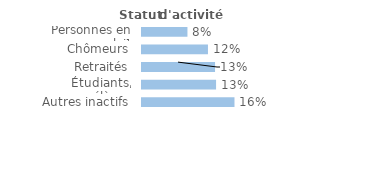
| Category | Series 0 |
|---|---|
| Personnes en emploi¹ | 0.08 |
| Chômeurs | 0.116 |
| Retraités | 0.129 |
| Étudiants, élèves | 0.131 |
| Autres inactifs  | 0.163 |